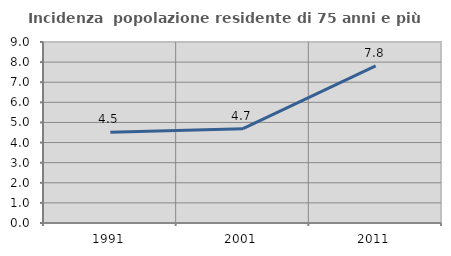
| Category | Incidenza  popolazione residente di 75 anni e più |
|---|---|
| 1991.0 | 4.508 |
| 2001.0 | 4.69 |
| 2011.0 | 7.815 |